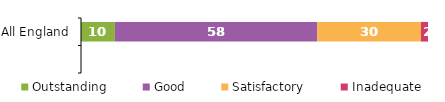
| Category | Outstanding | Good | Satisfactory | Inadequate |
|---|---|---|---|---|
| All England | 9.77 | 58.299 | 29.899 | 2.031 |